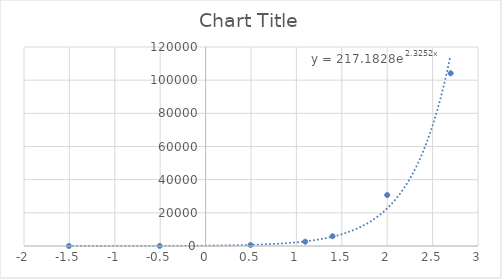
| Category | Series 0 |
|---|---|
| 2.6989700043360187 | 104134.5 |
| 2.0 | 30725 |
| 1.3979400086720377 | 5878.5 |
| 1.0969100130080565 | 2582 |
| 0.494850021680094 | 563 |
| -0.5051499783199059 | 56.5 |
| -1.505149978319906 | 8 |